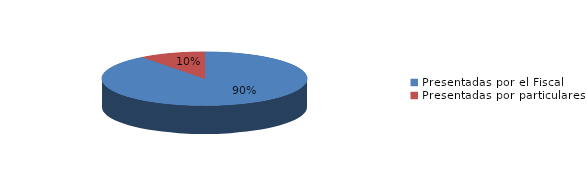
| Category | Series 0 |
|---|---|
| Presentadas por el Fiscal | 401 |
| Presentadas por particulares | 46 |